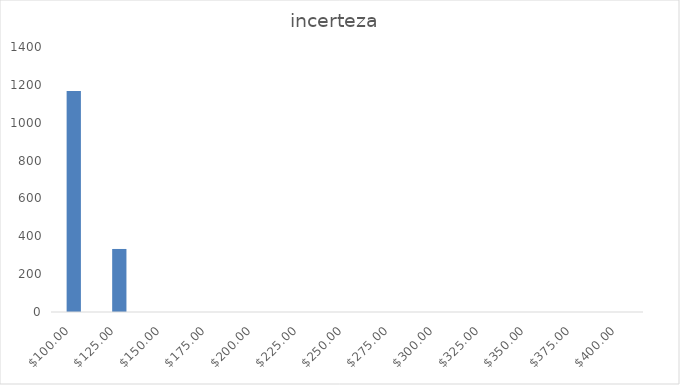
| Category | Series 0 |
|---|---|
| 100.0 | 1167 |
| 125.0 | 333 |
| 150.0 | 0 |
| 175.0 | 0 |
| 200.0 | 0 |
| 225.0 | 0 |
| 250.0 | 0 |
| 275.0 | 0 |
| 300.0 | 0 |
| 325.0 | 0 |
| 350.0 | 0 |
| 375.0 | 0 |
| 400.0 | 0 |